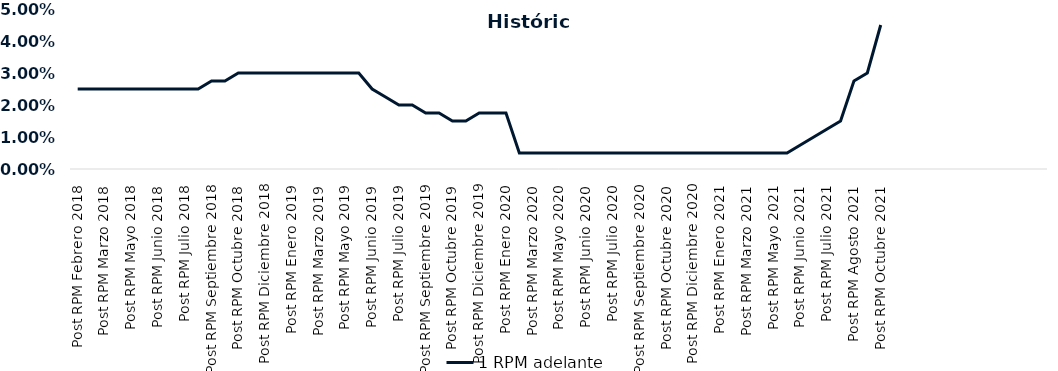
| Category | 1 RPM adelante |
|---|---|
| Post RPM Febrero 2018 | 0.025 |
| Pre RPM Marzo 2018 | 0.025 |
| Post RPM Marzo 2018 | 0.025 |
| Pre RPM Mayo 2018 | 0.025 |
| Post RPM Mayo 2018 | 0.025 |
| Pre RPM Junio 2018 | 0.025 |
| Post RPM Junio 2018 | 0.025 |
| Pre RPM Julio 2018 | 0.025 |
| Post RPM Julio 2018 | 0.025 |
| Pre RPM Septiembre 2018 | 0.025 |
| Post RPM Septiembre 2018 | 0.028 |
| Pre RPM Octubre 2018 | 0.028 |
| Post RPM Octubre 2018 | 0.03 |
| Pre RPM Diciembre 2018 | 0.03 |
| Post RPM Diciembre 2018 | 0.03 |
| Pre RPM Enero 2019 | 0.03 |
| Post RPM Enero 2019 | 0.03 |
| Pre RPM Marzo 2019 | 0.03 |
| Post RPM Marzo 2019 | 0.03 |
| Pre RPM Mayo 2019 | 0.03 |
| Post RPM Mayo 2019 | 0.03 |
| Pre RPM Junio 2019 | 0.03 |
| Post RPM Junio 2019 | 0.025 |
| Pre RPM Julio 2019 | 0.022 |
| Post RPM Julio 2019 | 0.02 |
| Pre RPM Septiembre 2019 | 0.02 |
| Post RPM Septiembre 2019 | 0.018 |
| Pre RPM Octubre 2019 | 0.018 |
| Post RPM Octubre 2019 | 0.015 |
| Pre RPM Diciembre 2019 | 0.015 |
| Post RPM Diciembre 2019 | 0.018 |
| Pre RPM Enero 2020 | 0.018 |
| Post RPM Enero 2020 | 0.018 |
| Pre RPM Marzo 2020 | 0.005 |
| Post RPM Marzo 2020 | 0.005 |
| Pre RPM Mayo 2020 | 0.005 |
| Post RPM Mayo 2020 | 0.005 |
| Pre RPM Junio 2020 | 0.005 |
| Post RPM Junio 2020 | 0.005 |
| Pre RPM Julio 2020 | 0.005 |
| Post RPM Julio 2020 | 0.005 |
| Pre RPM Septiembre 2020 | 0.005 |
| Post RPM Septiembre 2020 | 0.005 |
| Pre RPM Octubre 2020 | 0.005 |
| Post RPM Octubre 2020 | 0.005 |
| Pre RPM Diciembre 2020 | 0.005 |
| Post RPM Diciembre 2020 | 0.005 |
| Pre RPM Enero 2021 | 0.005 |
| Post RPM Enero 2021 | 0.005 |
| Pre RPM Marzo 2021 | 0.005 |
| Post RPM Marzo 2021 | 0.005 |
| Pre RPM Mayo 2021 | 0.005 |
| Post RPM Mayo 2021 | 0.005 |
| Pre RPM Junio 2021 | 0.005 |
| Post RPM Junio 2021 | 0.008 |
| Pre RPM Julio 2021 | 0.01 |
| Post RPM Julio 2021 | 0.012 |
| Pre RPM Agosto 2021 | 0.015 |
| Post RPM Agosto 2021 | 0.028 |
| Pre RPM Octubre 2021 | 0.03 |
| Post RPM Octubre 2021 | 0.045 |